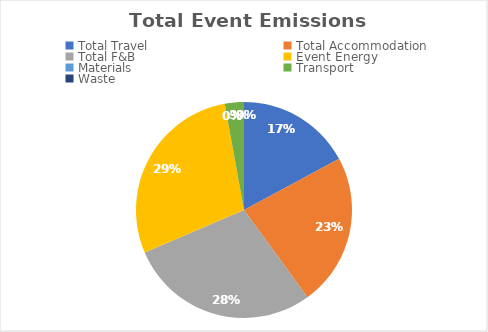
| Category | Series 0 |
|---|---|
| Total Travel | 0.12 |
| Total Accommodation | 0.16 |
| Total F&B | 0.2 |
| Event Energy | 0.2 |
| Materials | 0 |
| Transport | 0.02 |
| Waste | 0 |